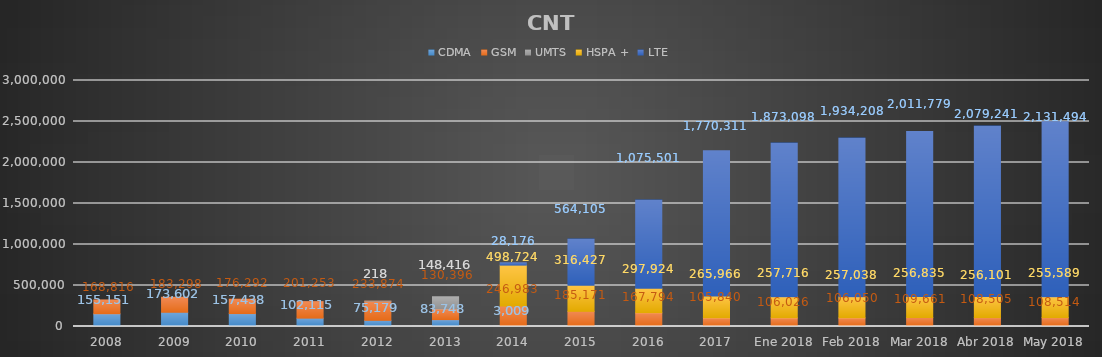
| Category | CDMA | GSM | UMTS | HSPA + | LTE |
|---|---|---|---|---|---|
| 2008 | 155151 | 168816 | 0 | 0 | 0 |
| 2009 | 173602 | 183298 | 0 | 0 | 0 |
| 2010 | 157438 | 176292 | 0 | 0 | 0 |
| 2011 | 102115 | 201253 | 0 | 0 | 0 |
| 2012 | 75179 | 233874 | 218 | 0 | 0 |
| 2013 | 83748 | 130396 | 148416 | 0 | 0 |
| 2014 | 3009 | 246983 | 0 | 498724 | 28176 |
| 2015 | 0 | 185171 | 0 | 316427 | 564105 |
| 2016 | 0 | 167794 | 0 | 297924 | 1075501 |
| 2017 | 0 | 105840 | 0 | 265966 | 1770311 |
| Ene 2018 | 0 | 106026 | 0 | 257716 | 1873098 |
| Feb 2018 | 0 | 106050 | 0 | 257038 | 1934208 |
| Mar 2018 | 0 | 109661 | 0 | 256835 | 2011779 |
| Abr 2018 | 0 | 108505 | 0 | 256101 | 2079241 |
| May 2018 | 0 | 108514 | 0 | 255589 | 2131494 |